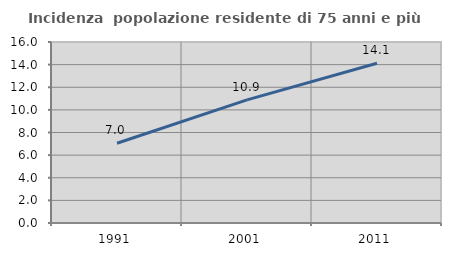
| Category | Incidenza  popolazione residente di 75 anni e più |
|---|---|
| 1991.0 | 7.046 |
| 2001.0 | 10.885 |
| 2011.0 | 14.124 |